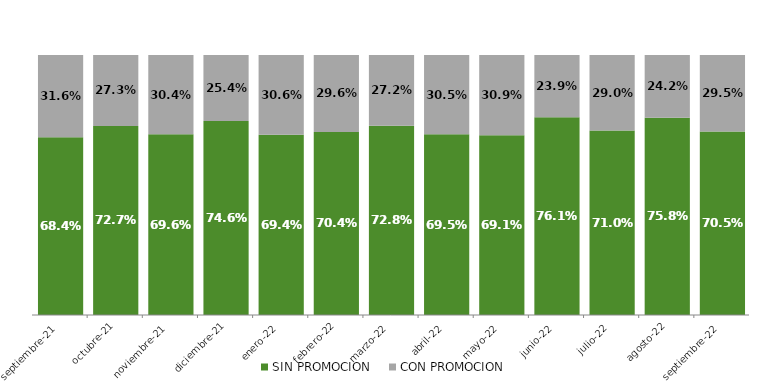
| Category | SIN PROMOCION   | CON PROMOCION   |
|---|---|---|
| 2021-09-01 | 0.684 | 0.316 |
| 2021-10-01 | 0.727 | 0.273 |
| 2021-11-01 | 0.696 | 0.304 |
| 2021-12-01 | 0.746 | 0.254 |
| 2022-01-01 | 0.694 | 0.306 |
| 2022-02-01 | 0.704 | 0.296 |
| 2022-03-01 | 0.728 | 0.272 |
| 2022-04-01 | 0.695 | 0.305 |
| 2022-05-01 | 0.691 | 0.309 |
| 2022-06-01 | 0.761 | 0.239 |
| 2022-07-01 | 0.71 | 0.29 |
| 2022-08-01 | 0.758 | 0.242 |
| 2022-09-01 | 0.705 | 0.295 |